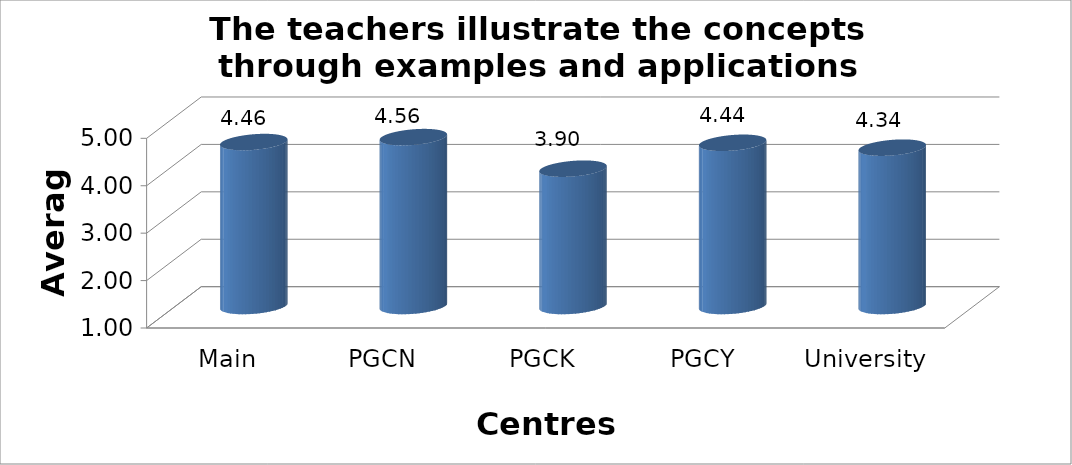
| Category | The teachers illustrate the concepts through examples and applications Every time |
|---|---|
| Main Campus | 4.457 |
| PGCN | 4.561 |
| PGCK | 3.896 |
| PGCY | 4.442 |
| University Avg | 4.339 |